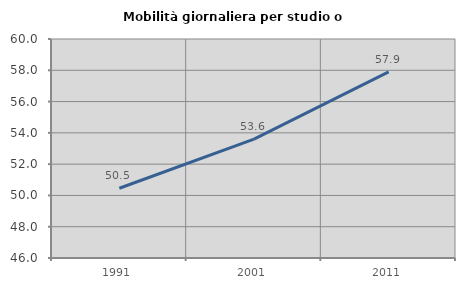
| Category | Mobilità giornaliera per studio o lavoro |
|---|---|
| 1991.0 | 50.459 |
| 2001.0 | 53.595 |
| 2011.0 | 57.897 |